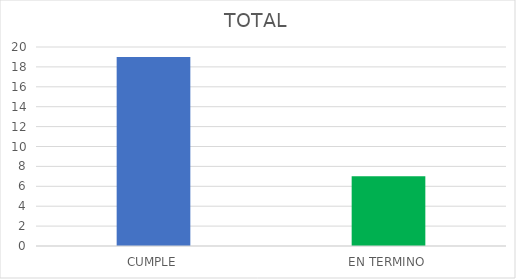
| Category | TOTAL |
|---|---|
| CUMPLE | 19 |
| EN TERMINO | 7 |